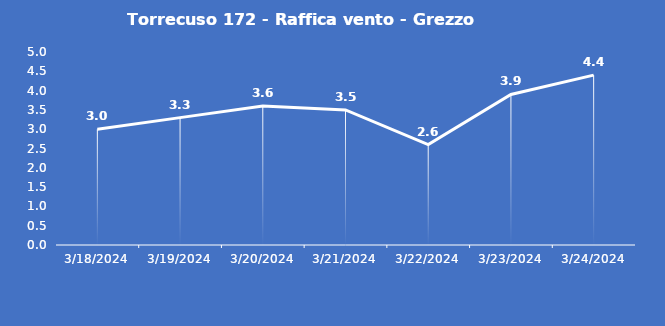
| Category | Torrecuso 172 - Raffica vento - Grezzo (m/s) |
|---|---|
| 3/18/24 | 3 |
| 3/19/24 | 3.3 |
| 3/20/24 | 3.6 |
| 3/21/24 | 3.5 |
| 3/22/24 | 2.6 |
| 3/23/24 | 3.9 |
| 3/24/24 | 4.4 |